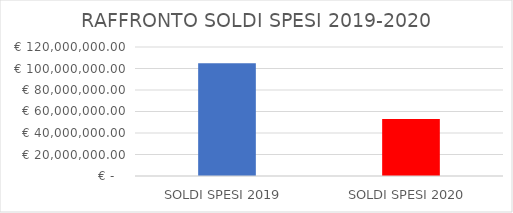
| Category | Series 0 |
|---|---|
|  SOLDI SPESI 2019  | 105000000 |
| SOLDI SPESI 2020 | 53000000 |